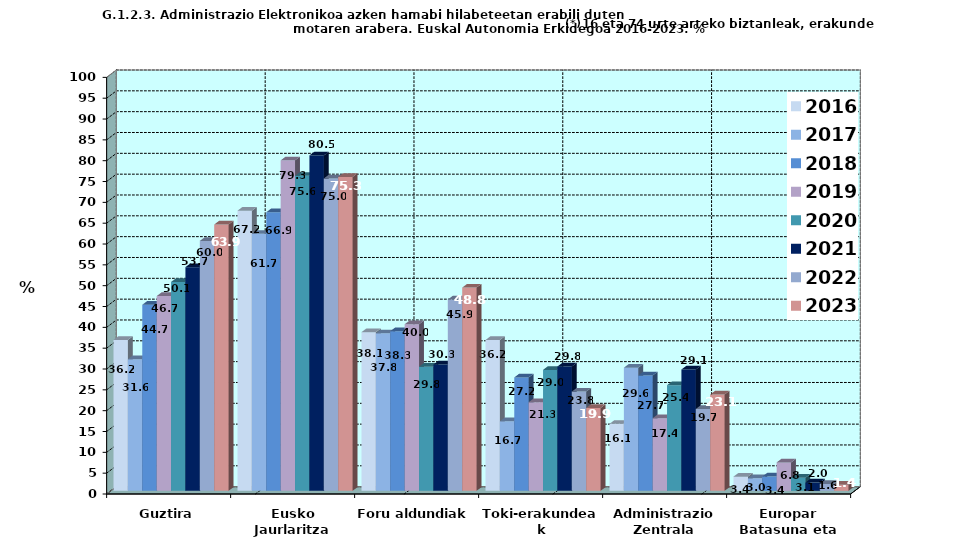
| Category | 2016 | 2017 | 2018 | 2019 | 2020 | 2021 | 2022 | 2023 |
|---|---|---|---|---|---|---|---|---|
| Guztira | 36.231 | 31.608 | 44.663 | 46.748 | 50.139 | 53.699 | 59.995 | 63.927 |
| Eusko Jaurlaritza | 67.249 | 61.687 | 66.88 | 79.325 | 75.608 | 80.505 | 74.974 | 75.335 |
| Foru aldundiak | 38.099 | 37.801 | 38.329 | 39.981 | 29.789 | 30.332 | 45.925 | 48.786 |
| Toki-erakundeak | 36.213 | 16.693 | 27.228 | 21.273 | 29.035 | 29.848 | 23.825 | 19.897 |
| Administrazio Zentrala | 16.081 | 29.562 | 27.688 | 17.433 | 25.367 | 29.122 | 19.657 | 23.131 |
| Europar Batasuna eta beste batzuk | 3.41 | 3.015 | 3.426 | 6.83 | 3.137 | 1.994 | 1.642 | 1.447 |